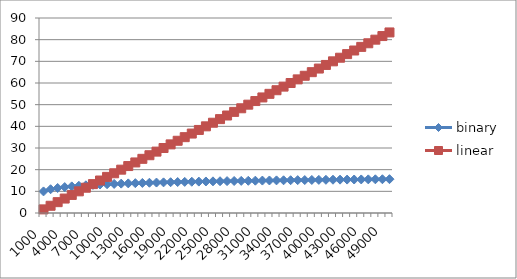
| Category | binary | linear |
|---|---|---|
| 1000.0 | 9.966 | 1.667 |
| 2000.0 | 10.966 | 3.333 |
| 3000.0 | 11.551 | 5 |
| 4000.0 | 11.966 | 6.667 |
| 5000.0 | 12.288 | 8.333 |
| 6000.0 | 12.551 | 10 |
| 7000.0 | 12.773 | 11.667 |
| 8000.0 | 12.966 | 13.333 |
| 9000.0 | 13.136 | 15 |
| 10000.0 | 13.288 | 16.667 |
| 11000.0 | 13.425 | 18.333 |
| 12000.0 | 13.551 | 20 |
| 13000.0 | 13.666 | 21.667 |
| 14000.0 | 13.773 | 23.333 |
| 15000.0 | 13.873 | 25 |
| 16000.0 | 13.966 | 26.667 |
| 17000.0 | 14.053 | 28.333 |
| 18000.0 | 14.136 | 30 |
| 19000.0 | 14.214 | 31.667 |
| 20000.0 | 14.288 | 33.333 |
| 21000.0 | 14.358 | 35 |
| 22000.0 | 14.425 | 36.667 |
| 23000.0 | 14.489 | 38.333 |
| 24000.0 | 14.551 | 40 |
| 25000.0 | 14.61 | 41.667 |
| 26000.0 | 14.666 | 43.333 |
| 27000.0 | 14.721 | 45 |
| 28000.0 | 14.773 | 46.667 |
| 29000.0 | 14.824 | 48.333 |
| 30000.0 | 14.873 | 50 |
| 31000.0 | 14.92 | 51.667 |
| 32000.0 | 14.966 | 53.333 |
| 33000.0 | 15.01 | 55 |
| 34000.0 | 15.053 | 56.667 |
| 35000.0 | 15.095 | 58.333 |
| 36000.0 | 15.136 | 60 |
| 37000.0 | 15.175 | 61.667 |
| 38000.0 | 15.214 | 63.333 |
| 39000.0 | 15.251 | 65 |
| 40000.0 | 15.288 | 66.667 |
| 41000.0 | 15.323 | 68.333 |
| 42000.0 | 15.358 | 70 |
| 43000.0 | 15.392 | 71.667 |
| 44000.0 | 15.425 | 73.333 |
| 45000.0 | 15.458 | 75 |
| 46000.0 | 15.489 | 76.667 |
| 47000.0 | 15.52 | 78.333 |
| 48000.0 | 15.551 | 80 |
| 49000.0 | 15.58 | 81.667 |
| 50000.0 | 15.61 | 83.333 |